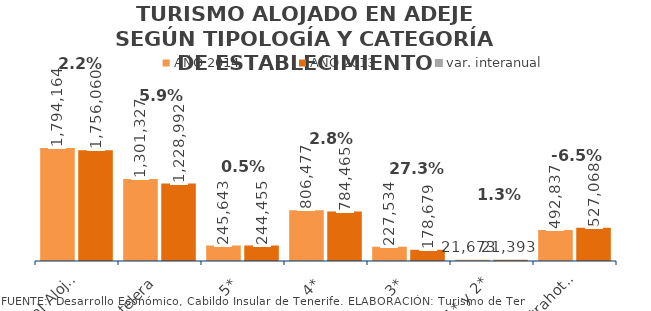
| Category | AÑO 2014 | AÑO 2013 |
|---|---|---|
| Total Alojados | 1794164 | 1756060 |
| Hotelera | 1301327 | 1228992 |
| 5* | 245643 | 244455 |
| 4* | 806477 | 784465 |
| 3* | 227534 | 178679 |
| 1* y 2* | 21673 | 21393 |
| Extrahotelera | 492837 | 527068 |